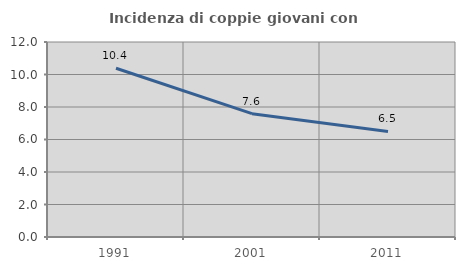
| Category | Incidenza di coppie giovani con figli |
|---|---|
| 1991.0 | 10.384 |
| 2001.0 | 7.589 |
| 2011.0 | 6.494 |